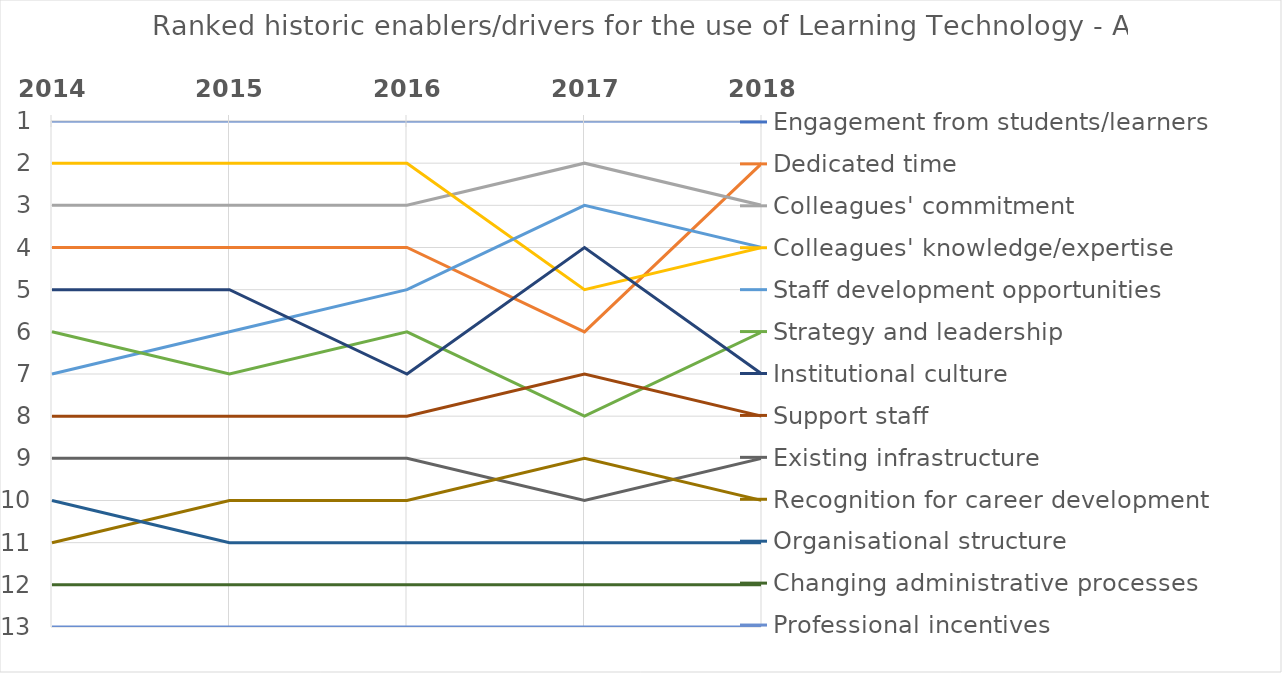
| Category | Engagement from students/learners | Dedicated time | Colleagues' commitment | Colleagues' knowledge/expertise | Staff development opportunities | Strategy and leadership | Institutional culture | Support staff | Existing infrastructure | Recognition for career development | Organisational structure | Changing administrative processes | Professional incentives |
|---|---|---|---|---|---|---|---|---|---|---|---|---|---|
| 2014.0 | 1 | 4 | 3 | 2 | 7 | 6 | 5 | 8 | 9 | 11 | 10 | 12 | 13 |
| 2015.0 | 1 | 4 | 3 | 2 | 6 | 7 | 5 | 8 | 9 | 10 | 11 | 12 | 13 |
| 2016.0 | 1 | 4 | 3 | 2 | 5 | 6 | 7 | 8 | 9 | 10 | 11 | 12 | 13 |
| 2017.0 | 1 | 6 | 2 | 5 | 3 | 8 | 4 | 7 | 10 | 9 | 11 | 12 | 13 |
| 2018.0 | 1 | 2 | 3 | 4 | 4 | 6 | 7 | 8 | 9 | 10 | 11 | 12 | 13 |